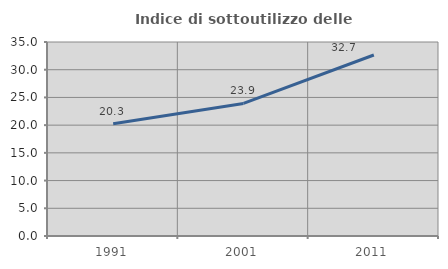
| Category | Indice di sottoutilizzo delle abitazioni  |
|---|---|
| 1991.0 | 20.262 |
| 2001.0 | 23.922 |
| 2011.0 | 32.658 |